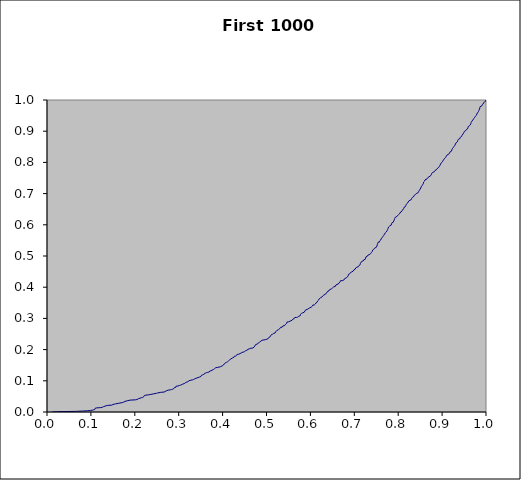
| Category | Series 0 |
|---|---|
| 0.011249421808192899 | 0 |
| 0.011249421808192899 | 0.001 |
| 0.021897918081891826 | 0.001 |
| 0.021897918081891826 | 0.002 |
| 0.06523315118367282 | 0.002 |
| 0.06523315118367282 | 0.003 |
| 0.0807544607324291 | 0.003 |
| 0.0807544607324291 | 0.004 |
| 0.09263250961139953 | 0.004 |
| 0.09263250961139953 | 0.005 |
| 0.09911125920864808 | 0.005 |
| 0.09911125920864808 | 0.006 |
| 0.10405232745592542 | 0.006 |
| 0.10405232745592542 | 0.007 |
| 0.10646404156951107 | 0.007 |
| 0.10646404156951107 | 0.008 |
| 0.10877796803790227 | 0.008 |
| 0.10877796803790227 | 0.009 |
| 0.1092573643612986 | 0.009 |
| 0.1092573643612986 | 0.01 |
| 0.10928343912602351 | 0.01 |
| 0.10928343912602351 | 0.011 |
| 0.1096808189038792 | 0.011 |
| 0.1096808189038792 | 0.012 |
| 0.11061091958944612 | 0.012 |
| 0.11061091958944612 | 0.013 |
| 0.11210296974543989 | 0.013 |
| 0.11210296974543989 | 0.014 |
| 0.12171973786751943 | 0.014 |
| 0.12171973786751943 | 0.015 |
| 0.12582377929541136 | 0.015 |
| 0.12582377929541136 | 0.016 |
| 0.12750954244039198 | 0.016 |
| 0.12750954244039198 | 0.017 |
| 0.1285424942450191 | 0.017 |
| 0.1285424942450191 | 0.018 |
| 0.1304585118417624 | 0.018 |
| 0.1304585118417624 | 0.019 |
| 0.13259435266144284 | 0.019 |
| 0.13259435266144284 | 0.02 |
| 0.13455305386940608 | 0.02 |
| 0.13455305386940608 | 0.021 |
| 0.13728534370316464 | 0.021 |
| 0.13728534370316464 | 0.022 |
| 0.14752125398919447 | 0.022 |
| 0.14752125398919447 | 0.023 |
| 0.14861249581178348 | 0.023 |
| 0.14861249581178348 | 0.024 |
| 0.15020557822087643 | 0.024 |
| 0.15020557822087643 | 0.025 |
| 0.15296926538120717 | 0.025 |
| 0.15296926538120717 | 0.026 |
| 0.15590705263605067 | 0.026 |
| 0.15590705263605067 | 0.027 |
| 0.1581368723343945 | 0.027 |
| 0.1581368723343945 | 0.028 |
| 0.16342433042483748 | 0.028 |
| 0.16342433042483748 | 0.029 |
| 0.1655110424803354 | 0.029 |
| 0.1655110424803354 | 0.03 |
| 0.1713311051522884 | 0.03 |
| 0.1713311051522884 | 0.031 |
| 0.17248337471203395 | 0.031 |
| 0.17248337471203395 | 0.032 |
| 0.1750887045038983 | 0.032 |
| 0.1750887045038983 | 0.033 |
| 0.17592749082593775 | 0.033 |
| 0.17592749082593775 | 0.034 |
| 0.17764236055978683 | 0.034 |
| 0.17764236055978683 | 0.035 |
| 0.17927532334015206 | 0.035 |
| 0.17927532334015206 | 0.036 |
| 0.18276183317802958 | 0.036 |
| 0.18276183317802958 | 0.037 |
| 0.18423369609616894 | 0.037 |
| 0.18423369609616894 | 0.038 |
| 0.18887326001306126 | 0.038 |
| 0.18887326001306126 | 0.039 |
| 0.20105487485812018 | 0.039 |
| 0.20105487485812018 | 0.04 |
| 0.20483416538454313 | 0.04 |
| 0.20483416538454313 | 0.041 |
| 0.20536459177715305 | 0.041 |
| 0.20536459177715305 | 0.042 |
| 0.20568834324547217 | 0.042 |
| 0.20568834324547217 | 0.043 |
| 0.20897664814304123 | 0.043 |
| 0.20897664814304123 | 0.044 |
| 0.21082633518358534 | 0.044 |
| 0.21082633518358534 | 0.045 |
| 0.21104864177050434 | 0.045 |
| 0.21104864177050434 | 0.046 |
| 0.21564698234092236 | 0.046 |
| 0.21564698234092236 | 0.047 |
| 0.21815375393502112 | 0.047 |
| 0.21815375393502112 | 0.048 |
| 0.21995019777628144 | 0.048 |
| 0.21995019777628144 | 0.049 |
| 0.2204865942727415 | 0.049 |
| 0.2204865942727415 | 0.05 |
| 0.22053192893236662 | 0.05 |
| 0.22053192893236662 | 0.051 |
| 0.22124137839260483 | 0.051 |
| 0.22124137839260483 | 0.052 |
| 0.22189559907805162 | 0.052 |
| 0.22189559907805162 | 0.053 |
| 0.22332866249805328 | 0.053 |
| 0.22332866249805328 | 0.054 |
| 0.225313524360659 | 0.054 |
| 0.225313524360659 | 0.055 |
| 0.23088702599780933 | 0.055 |
| 0.23088702599780933 | 0.056 |
| 0.2350986549685867 | 0.056 |
| 0.2350986549685867 | 0.057 |
| 0.23540107716843792 | 0.057 |
| 0.23540107716843792 | 0.058 |
| 0.24229875351471067 | 0.058 |
| 0.24229875351471067 | 0.059 |
| 0.24387414313903658 | 0.059 |
| 0.24387414313903658 | 0.06 |
| 0.2494074127996318 | 0.06 |
| 0.2494074127996318 | 0.061 |
| 0.25186187573036956 | 0.061 |
| 0.25186187573036956 | 0.062 |
| 0.2531476491343894 | 0.062 |
| 0.2531476491343894 | 0.063 |
| 0.2590508489690144 | 0.063 |
| 0.2590508489690144 | 0.064 |
| 0.2664827592374227 | 0.064 |
| 0.2664827592374227 | 0.065 |
| 0.2688020099562397 | 0.065 |
| 0.2688020099562397 | 0.066 |
| 0.26918575447161736 | 0.066 |
| 0.26918575447161736 | 0.067 |
| 0.27068364639911896 | 0.067 |
| 0.27068364639911896 | 0.068 |
| 0.27160345400900543 | 0.068 |
| 0.27160345400900543 | 0.069 |
| 0.2722355204352449 | 0.069 |
| 0.2722355204352449 | 0.07 |
| 0.2761165909060285 | 0.07 |
| 0.2761165909060285 | 0.071 |
| 0.28067163154526037 | 0.071 |
| 0.28067163154526037 | 0.072 |
| 0.2835442600330927 | 0.072 |
| 0.2835442600330927 | 0.073 |
| 0.2862815536726706 | 0.073 |
| 0.2862815536726706 | 0.074 |
| 0.2874402215660074 | 0.074 |
| 0.2874402215660074 | 0.075 |
| 0.2889093945239742 | 0.075 |
| 0.2889093945239742 | 0.076 |
| 0.2893299529715815 | 0.076 |
| 0.2893299529715815 | 0.077 |
| 0.29059601815584263 | 0.077 |
| 0.29059601815584263 | 0.078 |
| 0.29066765360203234 | 0.078 |
| 0.29066765360203234 | 0.079 |
| 0.293387623630287 | 0.079 |
| 0.293387623630287 | 0.08 |
| 0.293471716909933 | 0.08 |
| 0.293471716909933 | 0.081 |
| 0.2936748131528409 | 0.081 |
| 0.2936748131528409 | 0.082 |
| 0.29422580143166954 | 0.082 |
| 0.29422580143166954 | 0.083 |
| 0.2977863811714314 | 0.083 |
| 0.2977863811714314 | 0.084 |
| 0.30002222580208876 | 0.084 |
| 0.30002222580208876 | 0.085 |
| 0.3015306371026716 | 0.085 |
| 0.3015306371026716 | 0.086 |
| 0.3040463176200329 | 0.086 |
| 0.3040463176200329 | 0.087 |
| 0.30449822905675206 | 0.087 |
| 0.30449822905675206 | 0.088 |
| 0.3049871862406665 | 0.088 |
| 0.3049871862406665 | 0.089 |
| 0.3087590019793998 | 0.089 |
| 0.3087590019793998 | 0.09 |
| 0.30966212356720474 | 0.09 |
| 0.30966212356720474 | 0.091 |
| 0.3109875620651161 | 0.091 |
| 0.3109875620651161 | 0.092 |
| 0.3139640283720488 | 0.092 |
| 0.3139640283720488 | 0.093 |
| 0.3145524105345959 | 0.093 |
| 0.3145524105345959 | 0.094 |
| 0.3158534689207089 | 0.094 |
| 0.3158534689207089 | 0.095 |
| 0.3163986057475938 | 0.095 |
| 0.3163986057475938 | 0.096 |
| 0.31682415556491134 | 0.096 |
| 0.31682415556491134 | 0.097 |
| 0.32080660699942676 | 0.097 |
| 0.32080660699942676 | 0.098 |
| 0.3212219577814596 | 0.098 |
| 0.3212219577814596 | 0.099 |
| 0.3218245111582825 | 0.099 |
| 0.3218245111582825 | 0.1 |
| 0.32325844579217367 | 0.1 |
| 0.32325844579217367 | 0.101 |
| 0.3233912679575954 | 0.101 |
| 0.3233912679575954 | 0.102 |
| 0.3278516912646725 | 0.102 |
| 0.3278516912646725 | 0.103 |
| 0.3311631151056512 | 0.103 |
| 0.3311631151056512 | 0.104 |
| 0.3337775687308842 | 0.104 |
| 0.3337775687308842 | 0.105 |
| 0.33536681212985264 | 0.105 |
| 0.33536681212985264 | 0.106 |
| 0.3360530583206744 | 0.106 |
| 0.3360530583206744 | 0.107 |
| 0.33727365891195454 | 0.107 |
| 0.33727365891195454 | 0.108 |
| 0.33761581012432174 | 0.108 |
| 0.33761581012432174 | 0.109 |
| 0.3413597107412938 | 0.109 |
| 0.3413597107412938 | 0.11 |
| 0.3417449524486291 | 0.11 |
| 0.3417449524486291 | 0.111 |
| 0.34282517261200224 | 0.111 |
| 0.34282517261200224 | 0.112 |
| 0.3473685717020326 | 0.112 |
| 0.3473685717020326 | 0.113 |
| 0.3490914555433698 | 0.113 |
| 0.3490914555433698 | 0.114 |
| 0.35070825327676586 | 0.114 |
| 0.35070825327676586 | 0.115 |
| 0.3517873820542869 | 0.115 |
| 0.3517873820542869 | 0.116 |
| 0.35201455587927766 | 0.116 |
| 0.35201455587927766 | 0.117 |
| 0.3521976517083399 | 0.117 |
| 0.3521976517083399 | 0.118 |
| 0.3522035509403344 | 0.118 |
| 0.3522035509403344 | 0.119 |
| 0.3545239128471343 | 0.119 |
| 0.3545239128471343 | 0.12 |
| 0.35574020971307757 | 0.12 |
| 0.35574020971307757 | 0.121 |
| 0.3572883423053956 | 0.121 |
| 0.3572883423053956 | 0.122 |
| 0.35760124884739386 | 0.122 |
| 0.35760124884739386 | 0.123 |
| 0.35921498873511853 | 0.123 |
| 0.35921498873511853 | 0.124 |
| 0.3601877921714243 | 0.124 |
| 0.3601877921714243 | 0.125 |
| 0.3618108695276604 | 0.125 |
| 0.3618108695276604 | 0.126 |
| 0.3629439658469081 | 0.126 |
| 0.3629439658469081 | 0.127 |
| 0.36608536857781754 | 0.127 |
| 0.36608536857781754 | 0.128 |
| 0.3689463281720448 | 0.128 |
| 0.3689463281720448 | 0.129 |
| 0.3692220418669596 | 0.129 |
| 0.3692220418669596 | 0.13 |
| 0.370487820085008 | 0.13 |
| 0.370487820085008 | 0.131 |
| 0.3714015859730607 | 0.131 |
| 0.3714015859730607 | 0.132 |
| 0.3714711372366517 | 0.132 |
| 0.3714711372366517 | 0.133 |
| 0.37344216016006876 | 0.133 |
| 0.37344216016006876 | 0.134 |
| 0.3758157736674235 | 0.134 |
| 0.3758157736674235 | 0.135 |
| 0.3768092378812035 | 0.135 |
| 0.3768092378812035 | 0.136 |
| 0.3790477668345028 | 0.136 |
| 0.3790477668345028 | 0.137 |
| 0.3796178426483507 | 0.137 |
| 0.3796178426483507 | 0.138 |
| 0.3807772708818114 | 0.138 |
| 0.3807772708818114 | 0.139 |
| 0.38159103867862193 | 0.139 |
| 0.38159103867862193 | 0.14 |
| 0.3824347860305835 | 0.14 |
| 0.3824347860305835 | 0.141 |
| 0.3827413827421483 | 0.141 |
| 0.3827413827421483 | 0.142 |
| 0.3845599507331962 | 0.142 |
| 0.3845599507331962 | 0.143 |
| 0.38891042722963515 | 0.143 |
| 0.38891042722963515 | 0.144 |
| 0.39072047784214664 | 0.144 |
| 0.39072047784214664 | 0.145 |
| 0.3949585825001312 | 0.145 |
| 0.3949585825001312 | 0.146 |
| 0.39610399991559364 | 0.146 |
| 0.39610399991559364 | 0.147 |
| 0.39628005008507333 | 0.147 |
| 0.39628005008507333 | 0.148 |
| 0.3992876751969484 | 0.148 |
| 0.3992876751969484 | 0.149 |
| 0.40116779438668815 | 0.149 |
| 0.40116779438668815 | 0.15 |
| 0.4016791358136964 | 0.15 |
| 0.4016791358136964 | 0.151 |
| 0.40185636481461123 | 0.151 |
| 0.40185636481461123 | 0.152 |
| 0.4020348076575973 | 0.152 |
| 0.4020348076575973 | 0.153 |
| 0.40360673092895993 | 0.153 |
| 0.40360673092895993 | 0.154 |
| 0.40480905703892095 | 0.154 |
| 0.40480905703892095 | 0.155 |
| 0.4050719875682554 | 0.155 |
| 0.4050719875682554 | 0.156 |
| 0.40547329463613474 | 0.156 |
| 0.40547329463613474 | 0.157 |
| 0.4058862553466577 | 0.157 |
| 0.4058862553466577 | 0.158 |
| 0.4062285581140393 | 0.158 |
| 0.4062285581140393 | 0.159 |
| 0.4087463465819142 | 0.159 |
| 0.4087463465819142 | 0.16 |
| 0.4109655259528265 | 0.16 |
| 0.4109655259528265 | 0.161 |
| 0.41125949607083 | 0.161 |
| 0.41125949607083 | 0.162 |
| 0.4117396129395464 | 0.162 |
| 0.4117396129395464 | 0.163 |
| 0.4131650342620507 | 0.163 |
| 0.4131650342620507 | 0.164 |
| 0.41357675492989415 | 0.164 |
| 0.41357675492989415 | 0.165 |
| 0.4136700594340004 | 0.165 |
| 0.4136700594340004 | 0.166 |
| 0.4156614445506895 | 0.166 |
| 0.4156614445506895 | 0.167 |
| 0.41601854964437796 | 0.167 |
| 0.41601854964437796 | 0.168 |
| 0.41611290765455033 | 0.168 |
| 0.41611290765455033 | 0.169 |
| 0.417493631801864 | 0.169 |
| 0.417493631801864 | 0.17 |
| 0.4188916983045917 | 0.17 |
| 0.4188916983045917 | 0.171 |
| 0.4208379821221654 | 0.171 |
| 0.4208379821221654 | 0.172 |
| 0.42115373891967334 | 0.172 |
| 0.42115373891967334 | 0.173 |
| 0.42205031541449756 | 0.173 |
| 0.42205031541449756 | 0.174 |
| 0.42302253945022683 | 0.174 |
| 0.42302253945022683 | 0.175 |
| 0.4255545243436441 | 0.175 |
| 0.4255545243436441 | 0.176 |
| 0.4258677932433817 | 0.176 |
| 0.4258677932433817 | 0.177 |
| 0.42681194384335275 | 0.177 |
| 0.42681194384335275 | 0.178 |
| 0.4269480113402916 | 0.178 |
| 0.4269480113402916 | 0.179 |
| 0.42935621089261156 | 0.179 |
| 0.42935621089261156 | 0.18 |
| 0.4294714508657256 | 0.18 |
| 0.4294714508657256 | 0.181 |
| 0.43187029074810984 | 0.181 |
| 0.43187029074810984 | 0.182 |
| 0.43261605053863406 | 0.182 |
| 0.43261605053863406 | 0.183 |
| 0.43275833479768117 | 0.183 |
| 0.43275833479768117 | 0.184 |
| 0.43317002222324286 | 0.184 |
| 0.43317002222324286 | 0.185 |
| 0.43664353031998987 | 0.185 |
| 0.43664353031998987 | 0.186 |
| 0.4372563670955029 | 0.186 |
| 0.4372563670955029 | 0.187 |
| 0.4396434383547464 | 0.187 |
| 0.4396434383547464 | 0.188 |
| 0.4397017219194328 | 0.188 |
| 0.4397017219194328 | 0.189 |
| 0.44053109392780376 | 0.189 |
| 0.44053109392780376 | 0.19 |
| 0.4429448446810618 | 0.19 |
| 0.4429448446810618 | 0.191 |
| 0.4445297881575609 | 0.191 |
| 0.4445297881575609 | 0.192 |
| 0.4466935050245848 | 0.192 |
| 0.4466935050245848 | 0.193 |
| 0.44939216450777775 | 0.193 |
| 0.44939216450777775 | 0.194 |
| 0.450599185572192 | 0.194 |
| 0.450599185572192 | 0.195 |
| 0.4508285949500728 | 0.195 |
| 0.4508285949500728 | 0.196 |
| 0.45194962642018577 | 0.196 |
| 0.45194962642018577 | 0.197 |
| 0.4522911760754822 | 0.197 |
| 0.4522911760754822 | 0.198 |
| 0.4555851932242986 | 0.198 |
| 0.4555851932242986 | 0.199 |
| 0.4565087693150965 | 0.199 |
| 0.4565087693150965 | 0.2 |
| 0.457504789345731 | 0.2 |
| 0.457504789345731 | 0.201 |
| 0.45787742815257404 | 0.201 |
| 0.45787742815257404 | 0.202 |
| 0.46041356228416236 | 0.202 |
| 0.46041356228416236 | 0.203 |
| 0.4611192561323176 | 0.203 |
| 0.4611192561323176 | 0.204 |
| 0.46294729006585267 | 0.204 |
| 0.46294729006585267 | 0.205 |
| 0.4690134858084484 | 0.205 |
| 0.4690134858084484 | 0.206 |
| 0.4694699654079382 | 0.206 |
| 0.4694699654079382 | 0.207 |
| 0.4696967387535855 | 0.207 |
| 0.4696967387535855 | 0.208 |
| 0.4715600149139883 | 0.208 |
| 0.4715600149139883 | 0.209 |
| 0.4723377382072869 | 0.209 |
| 0.4723377382072869 | 0.21 |
| 0.47308162484055793 | 0.21 |
| 0.47308162484055793 | 0.211 |
| 0.4736276827972035 | 0.211 |
| 0.4736276827972035 | 0.212 |
| 0.47379882273148494 | 0.212 |
| 0.47379882273148494 | 0.213 |
| 0.4747578372860722 | 0.213 |
| 0.4747578372860722 | 0.214 |
| 0.4749102946972708 | 0.214 |
| 0.4749102946972708 | 0.215 |
| 0.4750225363021873 | 0.215 |
| 0.4750225363021873 | 0.216 |
| 0.4765904708324238 | 0.216 |
| 0.4765904708324238 | 0.217 |
| 0.4767378248125126 | 0.217 |
| 0.4767378248125126 | 0.218 |
| 0.47959608060456876 | 0.218 |
| 0.47959608060456876 | 0.219 |
| 0.47993215693303515 | 0.219 |
| 0.47993215693303515 | 0.22 |
| 0.480868711158164 | 0.22 |
| 0.480868711158164 | 0.221 |
| 0.4815846149410033 | 0.221 |
| 0.4815846149410033 | 0.222 |
| 0.4817563442199761 | 0.222 |
| 0.4817563442199761 | 0.223 |
| 0.4827006339544077 | 0.223 |
| 0.4827006339544077 | 0.224 |
| 0.4845554604608543 | 0.224 |
| 0.4845554604608543 | 0.225 |
| 0.48529274301962777 | 0.225 |
| 0.48529274301962777 | 0.226 |
| 0.4855100597031753 | 0.226 |
| 0.4855100597031753 | 0.227 |
| 0.4870680216350006 | 0.227 |
| 0.4870680216350006 | 0.228 |
| 0.48736225417345536 | 0.228 |
| 0.48736225417345536 | 0.229 |
| 0.48881520709044585 | 0.229 |
| 0.48881520709044585 | 0.23 |
| 0.48996516723415806 | 0.23 |
| 0.48996516723415806 | 0.231 |
| 0.49044035579272555 | 0.231 |
| 0.49044035579272555 | 0.232 |
| 0.4978272222617181 | 0.232 |
| 0.4978272222617181 | 0.233 |
| 0.4979410893410263 | 0.233 |
| 0.4979410893410263 | 0.234 |
| 0.5026501339941281 | 0.234 |
| 0.5026501339941281 | 0.235 |
| 0.5042813666066718 | 0.235 |
| 0.5042813666066718 | 0.236 |
| 0.5044220796463749 | 0.236 |
| 0.5044220796463749 | 0.237 |
| 0.5045342969493823 | 0.237 |
| 0.5045342969493823 | 0.238 |
| 0.505987843320744 | 0.238 |
| 0.505987843320744 | 0.239 |
| 0.5060850047002666 | 0.239 |
| 0.5060850047002666 | 0.24 |
| 0.507328387043216 | 0.24 |
| 0.507328387043216 | 0.241 |
| 0.5079773136335938 | 0.241 |
| 0.5079773136335938 | 0.242 |
| 0.5089497839653756 | 0.242 |
| 0.5089497839653756 | 0.243 |
| 0.5093478847308652 | 0.243 |
| 0.5093478847308652 | 0.244 |
| 0.5105190893524388 | 0.244 |
| 0.5105190893524388 | 0.245 |
| 0.5106794876541352 | 0.245 |
| 0.5106794876541352 | 0.246 |
| 0.5111668536550172 | 0.246 |
| 0.5111668536550172 | 0.247 |
| 0.5112188816457179 | 0.247 |
| 0.5112188816457179 | 0.248 |
| 0.5126215997905283 | 0.248 |
| 0.5126215997905283 | 0.249 |
| 0.5137686408569023 | 0.249 |
| 0.5137686408569023 | 0.25 |
| 0.5141487028402247 | 0.25 |
| 0.5141487028402247 | 0.251 |
| 0.514722558956099 | 0.251 |
| 0.514722558956099 | 0.252 |
| 0.5164883680601163 | 0.252 |
| 0.5164883680601163 | 0.253 |
| 0.5193759139264669 | 0.253 |
| 0.5193759139264669 | 0.254 |
| 0.5197598293443793 | 0.254 |
| 0.5197598293443793 | 0.255 |
| 0.5203232977164203 | 0.255 |
| 0.5203232977164203 | 0.256 |
| 0.5209627517010066 | 0.256 |
| 0.5209627517010066 | 0.257 |
| 0.5222140856684551 | 0.257 |
| 0.5222140856684551 | 0.258 |
| 0.5224796490614518 | 0.258 |
| 0.5224796490614518 | 0.259 |
| 0.5226923157140931 | 0.259 |
| 0.5226923157140931 | 0.26 |
| 0.5232346469884467 | 0.26 |
| 0.5232346469884467 | 0.261 |
| 0.524535123631277 | 0.261 |
| 0.524535123631277 | 0.262 |
| 0.5251040575780742 | 0.262 |
| 0.5251040575780742 | 0.263 |
| 0.5252651934115584 | 0.263 |
| 0.5252651934115584 | 0.264 |
| 0.5272489011610515 | 0.264 |
| 0.5272489011610515 | 0.265 |
| 0.5275197052584345 | 0.265 |
| 0.5275197052584345 | 0.266 |
| 0.5282280736531123 | 0.266 |
| 0.5282280736531123 | 0.267 |
| 0.5301658856525227 | 0.267 |
| 0.5301658856525227 | 0.268 |
| 0.5302459693545999 | 0.268 |
| 0.5302459693545999 | 0.269 |
| 0.5315755258477963 | 0.269 |
| 0.5315755258477963 | 0.27 |
| 0.5317405542700235 | 0.27 |
| 0.5317405542700235 | 0.271 |
| 0.5319055391571146 | 0.271 |
| 0.5319055391571146 | 0.272 |
| 0.5358197725093767 | 0.272 |
| 0.5358197725093767 | 0.273 |
| 0.5362136401298212 | 0.273 |
| 0.5362136401298212 | 0.274 |
| 0.5370611730514834 | 0.274 |
| 0.5370611730514834 | 0.275 |
| 0.5375823166879748 | 0.275 |
| 0.5375823166879748 | 0.276 |
| 0.5395910689444929 | 0.276 |
| 0.5395910689444929 | 0.277 |
| 0.541476323440487 | 0.277 |
| 0.541476323440487 | 0.278 |
| 0.5427317754742556 | 0.278 |
| 0.5427317754742556 | 0.279 |
| 0.5429355325817526 | 0.279 |
| 0.5429355325817526 | 0.28 |
| 0.5433550089578614 | 0.28 |
| 0.5433550089578614 | 0.281 |
| 0.5438411885343831 | 0.281 |
| 0.5438411885343831 | 0.282 |
| 0.5440309159428603 | 0.282 |
| 0.5440309159428603 | 0.283 |
| 0.5450122353596646 | 0.283 |
| 0.5450122353596646 | 0.284 |
| 0.545947966389704 | 0.284 |
| 0.545947966389704 | 0.285 |
| 0.5463656162412323 | 0.285 |
| 0.5463656162412323 | 0.286 |
| 0.5464352212521673 | 0.286 |
| 0.5464352212521673 | 0.287 |
| 0.5464514037587934 | 0.287 |
| 0.5464514037587934 | 0.288 |
| 0.548305105457441 | 0.288 |
| 0.548305105457441 | 0.289 |
| 0.55001237851328 | 0.289 |
| 0.55001237851328 | 0.29 |
| 0.5516540407877566 | 0.29 |
| 0.5516540407877566 | 0.291 |
| 0.5521184966493393 | 0.291 |
| 0.5521184966493393 | 0.292 |
| 0.5551500112860211 | 0.292 |
| 0.5551500112860211 | 0.293 |
| 0.5558883896185011 | 0.293 |
| 0.5558883896185011 | 0.294 |
| 0.5583286015876231 | 0.294 |
| 0.5583286015876231 | 0.295 |
| 0.5587892659396099 | 0.295 |
| 0.5587892659396099 | 0.296 |
| 0.5593375574130077 | 0.296 |
| 0.5593375574130077 | 0.297 |
| 0.5604019296922261 | 0.297 |
| 0.5604019296922261 | 0.298 |
| 0.5626280067760266 | 0.298 |
| 0.5626280067760266 | 0.299 |
| 0.5627445769298121 | 0.299 |
| 0.5627445769298121 | 0.3 |
| 0.5638732604246404 | 0.3 |
| 0.5638732604246404 | 0.301 |
| 0.5639650438164676 | 0.301 |
| 0.5639650438164676 | 0.302 |
| 0.5643976594642972 | 0.302 |
| 0.5643976594642972 | 0.303 |
| 0.5680648654399378 | 0.303 |
| 0.5680648654399378 | 0.304 |
| 0.5710785995505661 | 0.304 |
| 0.5710785995505661 | 0.305 |
| 0.5718063373089591 | 0.305 |
| 0.5718063373089591 | 0.306 |
| 0.5720645291946762 | 0.306 |
| 0.5720645291946762 | 0.307 |
| 0.573709233438035 | 0.307 |
| 0.573709233438035 | 0.308 |
| 0.5748652888355352 | 0.308 |
| 0.5748652888355352 | 0.309 |
| 0.5770825256018898 | 0.309 |
| 0.5770825256018898 | 0.31 |
| 0.5771866483174436 | 0.31 |
| 0.5771866483174436 | 0.311 |
| 0.5772235433478209 | 0.311 |
| 0.5772235433478209 | 0.312 |
| 0.5773109266677225 | 0.312 |
| 0.5773109266677225 | 0.313 |
| 0.5786188973226809 | 0.313 |
| 0.5786188973226809 | 0.314 |
| 0.5786389403124875 | 0.314 |
| 0.5786389403124875 | 0.315 |
| 0.5787774493492687 | 0.315 |
| 0.5787774493492687 | 0.316 |
| 0.5796776962765396 | 0.316 |
| 0.5796776962765396 | 0.317 |
| 0.5818660285440289 | 0.317 |
| 0.5818660285440289 | 0.318 |
| 0.5826749042815463 | 0.318 |
| 0.5826749042815463 | 0.319 |
| 0.5833835432091734 | 0.319 |
| 0.5833835432091734 | 0.32 |
| 0.5860751653624666 | 0.32 |
| 0.5860751653624666 | 0.321 |
| 0.586673400013422 | 0.321 |
| 0.586673400013422 | 0.322 |
| 0.5869734183578232 | 0.322 |
| 0.5869734183578232 | 0.323 |
| 0.587597544816653 | 0.323 |
| 0.587597544816653 | 0.324 |
| 0.5881289013950803 | 0.324 |
| 0.5881289013950803 | 0.325 |
| 0.5891415100655889 | 0.325 |
| 0.5891415100655889 | 0.326 |
| 0.5893201097785676 | 0.326 |
| 0.5893201097785676 | 0.327 |
| 0.5896580512216921 | 0.327 |
| 0.5896580512216921 | 0.328 |
| 0.5924530931749203 | 0.328 |
| 0.5924530931749203 | 0.329 |
| 0.5931702757522926 | 0.329 |
| 0.5931702757522926 | 0.33 |
| 0.5937570572916097 | 0.33 |
| 0.5937570572916097 | 0.331 |
| 0.5948986407286679 | 0.331 |
| 0.5948986407286679 | 0.332 |
| 0.5968504239479828 | 0.332 |
| 0.5968504239479828 | 0.333 |
| 0.59746225229825 | 0.333 |
| 0.59746225229825 | 0.334 |
| 0.5975039492726097 | 0.334 |
| 0.5975039492726097 | 0.335 |
| 0.5986512667009289 | 0.335 |
| 0.5986512667009289 | 0.336 |
| 0.6017974682787703 | 0.336 |
| 0.6017974682787703 | 0.337 |
| 0.6020101268498207 | 0.337 |
| 0.6020101268498207 | 0.338 |
| 0.6031920830625958 | 0.338 |
| 0.6031920830625958 | 0.339 |
| 0.6043168455677775 | 0.339 |
| 0.6043168455677775 | 0.34 |
| 0.6043194599973373 | 0.34 |
| 0.6043194599973373 | 0.341 |
| 0.6051132932854387 | 0.341 |
| 0.6051132932854387 | 0.342 |
| 0.6057763103128806 | 0.342 |
| 0.6057763103128806 | 0.343 |
| 0.6088111327461219 | 0.343 |
| 0.6088111327461219 | 0.344 |
| 0.6094166354823576 | 0.344 |
| 0.6094166354823576 | 0.345 |
| 0.6106860507347589 | 0.345 |
| 0.6106860507347589 | 0.346 |
| 0.6111514266677441 | 0.346 |
| 0.6111514266677441 | 0.347 |
| 0.6119188503874389 | 0.347 |
| 0.6119188503874389 | 0.348 |
| 0.6121558833473152 | 0.348 |
| 0.6121558833473152 | 0.349 |
| 0.6129847978524068 | 0.349 |
| 0.6129847978524068 | 0.35 |
| 0.6131794083992589 | 0.35 |
| 0.6131794083992589 | 0.351 |
| 0.6145048868322224 | 0.351 |
| 0.6145048868322224 | 0.352 |
| 0.6152903382579977 | 0.352 |
| 0.6152903382579977 | 0.353 |
| 0.6154327094016 | 0.353 |
| 0.6154327094016 | 0.354 |
| 0.616355204360489 | 0.354 |
| 0.616355204360489 | 0.355 |
| 0.6164817933497344 | 0.355 |
| 0.6164817933497344 | 0.356 |
| 0.6180251090993006 | 0.356 |
| 0.6180251090993006 | 0.357 |
| 0.6182573211400452 | 0.357 |
| 0.6182573211400452 | 0.358 |
| 0.6187366238254061 | 0.358 |
| 0.6187366238254061 | 0.359 |
| 0.6188268152584875 | 0.359 |
| 0.6188268152584875 | 0.36 |
| 0.6192585962134232 | 0.36 |
| 0.6192585962134232 | 0.361 |
| 0.6196592609244207 | 0.361 |
| 0.6196592609244207 | 0.362 |
| 0.6202401608683943 | 0.362 |
| 0.6202401608683943 | 0.363 |
| 0.6212044414760152 | 0.363 |
| 0.6212044414760152 | 0.364 |
| 0.6214380213070004 | 0.364 |
| 0.6214380213070004 | 0.365 |
| 0.6219687799350214 | 0.365 |
| 0.6219687799350214 | 0.366 |
| 0.6229371842826005 | 0.366 |
| 0.6229371842826005 | 0.367 |
| 0.6236564252665228 | 0.367 |
| 0.6236564252665228 | 0.368 |
| 0.6259761423871857 | 0.368 |
| 0.6259761423871857 | 0.369 |
| 0.6264756570670645 | 0.369 |
| 0.6264756570670645 | 0.37 |
| 0.626537151355475 | 0.37 |
| 0.626537151355475 | 0.371 |
| 0.627905607655712 | 0.371 |
| 0.627905607655712 | 0.372 |
| 0.6287738836301561 | 0.372 |
| 0.6287738836301561 | 0.373 |
| 0.6294430686842593 | 0.373 |
| 0.6294430686842593 | 0.374 |
| 0.6296110434668066 | 0.374 |
| 0.6296110434668066 | 0.375 |
| 0.6305541138914029 | 0.375 |
| 0.6305541138914029 | 0.376 |
| 0.6325986662555002 | 0.376 |
| 0.6325986662555002 | 0.377 |
| 0.6339704736572748 | 0.377 |
| 0.6339704736572748 | 0.378 |
| 0.6351498407558812 | 0.378 |
| 0.6351498407558812 | 0.379 |
| 0.6353387721957354 | 0.379 |
| 0.6353387721957354 | 0.38 |
| 0.6357810547119966 | 0.38 |
| 0.6357810547119966 | 0.381 |
| 0.6369923003584173 | 0.381 |
| 0.6369923003584173 | 0.382 |
| 0.6379083372527639 | 0.382 |
| 0.6379083372527639 | 0.383 |
| 0.6381330027209235 | 0.383 |
| 0.6381330027209235 | 0.384 |
| 0.6387644151629712 | 0.384 |
| 0.6387644151629712 | 0.385 |
| 0.6389945888632037 | 0.385 |
| 0.6389945888632037 | 0.386 |
| 0.639362838360495 | 0.386 |
| 0.639362838360495 | 0.387 |
| 0.6406196227771356 | 0.387 |
| 0.6406196227771356 | 0.388 |
| 0.6422337999780982 | 0.388 |
| 0.6422337999780982 | 0.389 |
| 0.6427080383394862 | 0.389 |
| 0.6427080383394862 | 0.39 |
| 0.6428965883266488 | 0.39 |
| 0.6428965883266488 | 0.391 |
| 0.64350231229169 | 0.391 |
| 0.64350231229169 | 0.392 |
| 0.6436258939187907 | 0.392 |
| 0.6436258939187907 | 0.393 |
| 0.6448024426011549 | 0.393 |
| 0.6448024426011549 | 0.394 |
| 0.6448834496736491 | 0.394 |
| 0.6448834496736491 | 0.395 |
| 0.6483094953767626 | 0.395 |
| 0.6483094953767626 | 0.396 |
| 0.6486144570609997 | 0.396 |
| 0.6486144570609997 | 0.397 |
| 0.6498340048658052 | 0.397 |
| 0.6498340048658052 | 0.398 |
| 0.6507382011252372 | 0.398 |
| 0.6507382011252372 | 0.399 |
| 0.6517704356523994 | 0.399 |
| 0.6517704356523994 | 0.4 |
| 0.6524516724594362 | 0.4 |
| 0.6524516724594362 | 0.401 |
| 0.6530821035511961 | 0.401 |
| 0.6530821035511961 | 0.402 |
| 0.654077805916523 | 0.402 |
| 0.654077805916523 | 0.403 |
| 0.6572314267891367 | 0.403 |
| 0.6572314267891367 | 0.404 |
| 0.6576374780408114 | 0.404 |
| 0.6576374780408114 | 0.405 |
| 0.6579374729901266 | 0.405 |
| 0.6579374729901266 | 0.406 |
| 0.6579604586271598 | 0.406 |
| 0.6579604586271598 | 0.407 |
| 0.6585972963268428 | 0.407 |
| 0.6585972963268428 | 0.408 |
| 0.6600562271376746 | 0.408 |
| 0.6600562271376746 | 0.409 |
| 0.660586238051264 | 0.409 |
| 0.660586238051264 | 0.41 |
| 0.6633924613668194 | 0.41 |
| 0.6633924613668194 | 0.411 |
| 0.6642234446949064 | 0.411 |
| 0.6642234446949064 | 0.412 |
| 0.6645869579258277 | 0.412 |
| 0.6645869579258277 | 0.413 |
| 0.6652625014112356 | 0.413 |
| 0.6652625014112356 | 0.414 |
| 0.6666106008838641 | 0.414 |
| 0.6666106008838641 | 0.415 |
| 0.6667663082441025 | 0.415 |
| 0.6667663082441025 | 0.416 |
| 0.6670120312543087 | 0.416 |
| 0.6670120312543087 | 0.417 |
| 0.6676059935887697 | 0.417 |
| 0.6676059935887697 | 0.418 |
| 0.6680865847296211 | 0.418 |
| 0.6680865847296211 | 0.419 |
| 0.6685499303397504 | 0.419 |
| 0.6685499303397504 | 0.42 |
| 0.6686750506797231 | 0.42 |
| 0.6686750506797231 | 0.421 |
| 0.67283254265387 | 0.421 |
| 0.67283254265387 | 0.422 |
| 0.6733218516093241 | 0.422 |
| 0.6733218516093241 | 0.423 |
| 0.6762284886850896 | 0.423 |
| 0.6762284886850896 | 0.424 |
| 0.6763473046152666 | 0.424 |
| 0.6763473046152666 | 0.425 |
| 0.6767232202972496 | 0.425 |
| 0.6767232202972496 | 0.426 |
| 0.6776075672373701 | 0.426 |
| 0.6776075672373701 | 0.427 |
| 0.6778118258765987 | 0.427 |
| 0.6778118258765987 | 0.428 |
| 0.6778582361262263 | 0.428 |
| 0.6778582361262263 | 0.429 |
| 0.6789905823304688 | 0.429 |
| 0.6789905823304688 | 0.43 |
| 0.681645327506794 | 0.43 |
| 0.681645327506794 | 0.431 |
| 0.6822476428984726 | 0.431 |
| 0.6822476428984726 | 0.432 |
| 0.682624196593867 | 0.432 |
| 0.682624196593867 | 0.433 |
| 0.6846004599829131 | 0.433 |
| 0.6846004599829131 | 0.434 |
| 0.6846977220898196 | 0.434 |
| 0.6846977220898196 | 0.435 |
| 0.6855616080756904 | 0.435 |
| 0.6855616080756904 | 0.436 |
| 0.6860751023719516 | 0.436 |
| 0.6860751023719516 | 0.437 |
| 0.6861839954865749 | 0.437 |
| 0.6861839954865749 | 0.438 |
| 0.6861849000370659 | 0.438 |
| 0.6861849000370659 | 0.439 |
| 0.6863860104837008 | 0.439 |
| 0.6863860104837008 | 0.44 |
| 0.6865670267984291 | 0.44 |
| 0.6865670267984291 | 0.441 |
| 0.6874446985646274 | 0.441 |
| 0.6874446985646274 | 0.442 |
| 0.6882782710888955 | 0.442 |
| 0.6882782710888955 | 0.443 |
| 0.6896915569578116 | 0.443 |
| 0.6896915569578116 | 0.444 |
| 0.6898571975173683 | 0.444 |
| 0.6898571975173683 | 0.445 |
| 0.6903026574554162 | 0.445 |
| 0.6903026574554162 | 0.446 |
| 0.6913695420050707 | 0.446 |
| 0.6913695420050707 | 0.447 |
| 0.6915308408137609 | 0.447 |
| 0.6915308408137609 | 0.448 |
| 0.6923813339461344 | 0.448 |
| 0.6923813339461344 | 0.449 |
| 0.6941687461939142 | 0.449 |
| 0.6941687461939142 | 0.45 |
| 0.6958572557928987 | 0.45 |
| 0.6958572557928987 | 0.451 |
| 0.6960995520674406 | 0.451 |
| 0.6960995520674406 | 0.452 |
| 0.6978870138762474 | 0.452 |
| 0.6978870138762474 | 0.453 |
| 0.698717148913131 | 0.453 |
| 0.698717148913131 | 0.454 |
| 0.6992493291324154 | 0.454 |
| 0.6992493291324154 | 0.455 |
| 0.6992722281819722 | 0.455 |
| 0.6992722281819722 | 0.456 |
| 0.7006465266287069 | 0.456 |
| 0.7006465266287069 | 0.457 |
| 0.7011734080620532 | 0.457 |
| 0.7011734080620532 | 0.458 |
| 0.7022427228340677 | 0.458 |
| 0.7022427228340677 | 0.459 |
| 0.702259479973941 | 0.459 |
| 0.702259479973941 | 0.46 |
| 0.7025308553214654 | 0.46 |
| 0.7025308553214654 | 0.461 |
| 0.7033348493076537 | 0.461 |
| 0.7033348493076537 | 0.462 |
| 0.7053757134470637 | 0.462 |
| 0.7053757134470637 | 0.463 |
| 0.7055537547255659 | 0.463 |
| 0.7055537547255659 | 0.464 |
| 0.7057855669717615 | 0.464 |
| 0.7057855669717615 | 0.465 |
| 0.7068754775879608 | 0.465 |
| 0.7068754775879608 | 0.466 |
| 0.7094359861818292 | 0.466 |
| 0.7094359861818292 | 0.467 |
| 0.7098587908932787 | 0.467 |
| 0.7098587908932787 | 0.468 |
| 0.7109323913455288 | 0.468 |
| 0.7109323913455288 | 0.469 |
| 0.7110020552571784 | 0.469 |
| 0.7110020552571784 | 0.47 |
| 0.7115600840500821 | 0.47 |
| 0.7115600840500821 | 0.471 |
| 0.7123260721053666 | 0.471 |
| 0.7123260721053666 | 0.472 |
| 0.7133202232690652 | 0.472 |
| 0.7133202232690652 | 0.473 |
| 0.7133662142828301 | 0.473 |
| 0.7133662142828301 | 0.474 |
| 0.7136273637402631 | 0.474 |
| 0.7136273637402631 | 0.475 |
| 0.7138754298990462 | 0.475 |
| 0.7138754298990462 | 0.476 |
| 0.7140672549197272 | 0.476 |
| 0.7140672549197272 | 0.477 |
| 0.7141230464399799 | 0.477 |
| 0.7141230464399799 | 0.478 |
| 0.7141568127062209 | 0.478 |
| 0.7141568127062209 | 0.479 |
| 0.7150229321139121 | 0.479 |
| 0.7150229321139121 | 0.48 |
| 0.715992288373078 | 0.48 |
| 0.715992288373078 | 0.481 |
| 0.7165571234462058 | 0.481 |
| 0.7165571234462058 | 0.482 |
| 0.7166873041495803 | 0.482 |
| 0.7166873041495803 | 0.483 |
| 0.718014460256699 | 0.483 |
| 0.718014460256699 | 0.484 |
| 0.7203130081390077 | 0.484 |
| 0.7203130081390077 | 0.485 |
| 0.7203936252178358 | 0.485 |
| 0.7203936252178358 | 0.486 |
| 0.7213106732734584 | 0.486 |
| 0.7213106732734584 | 0.487 |
| 0.7216432709367213 | 0.487 |
| 0.7216432709367213 | 0.488 |
| 0.7237741407136123 | 0.488 |
| 0.7237741407136123 | 0.489 |
| 0.724675170846741 | 0.489 |
| 0.724675170846741 | 0.49 |
| 0.7256004104927262 | 0.49 |
| 0.7256004104927262 | 0.491 |
| 0.7256980529907919 | 0.491 |
| 0.7256980529907919 | 0.492 |
| 0.7257639014780729 | 0.492 |
| 0.7257639014780729 | 0.493 |
| 0.725906271104606 | 0.493 |
| 0.725906271104606 | 0.494 |
| 0.726176735775662 | 0.494 |
| 0.726176735775662 | 0.495 |
| 0.726229524773025 | 0.495 |
| 0.726229524773025 | 0.496 |
| 0.7264253804586218 | 0.496 |
| 0.7264253804586218 | 0.497 |
| 0.7273410493821855 | 0.497 |
| 0.7273410493821855 | 0.498 |
| 0.7279627282345337 | 0.498 |
| 0.7279627282345337 | 0.499 |
| 0.7296632391733259 | 0.499 |
| 0.7296632391733259 | 0.5 |
| 0.7301687676205353 | 0.5 |
| 0.7301687676205353 | 0.501 |
| 0.7306725357279564 | 0.501 |
| 0.7306725357279564 | 0.502 |
| 0.7309586610580624 | 0.502 |
| 0.7309586610580624 | 0.503 |
| 0.7323769524062279 | 0.503 |
| 0.7323769524062279 | 0.504 |
| 0.733744908399423 | 0.504 |
| 0.733744908399423 | 0.505 |
| 0.7350158527704594 | 0.505 |
| 0.7350158527704594 | 0.506 |
| 0.7359840833404877 | 0.506 |
| 0.7359840833404877 | 0.507 |
| 0.7367924222642332 | 0.507 |
| 0.7367924222642332 | 0.508 |
| 0.7374461408638304 | 0.508 |
| 0.7374461408638304 | 0.509 |
| 0.7379289512883268 | 0.509 |
| 0.7379289512883268 | 0.51 |
| 0.7388949778293331 | 0.51 |
| 0.7388949778293331 | 0.511 |
| 0.7401082279542218 | 0.511 |
| 0.7401082279542218 | 0.512 |
| 0.7406728593308244 | 0.512 |
| 0.7406728593308244 | 0.513 |
| 0.7408600242821723 | 0.513 |
| 0.7408600242821723 | 0.514 |
| 0.7410794001504826 | 0.514 |
| 0.7410794001504826 | 0.515 |
| 0.7410925603203764 | 0.515 |
| 0.7410925603203764 | 0.516 |
| 0.741719255484518 | 0.516 |
| 0.741719255484518 | 0.517 |
| 0.7417217741133836 | 0.517 |
| 0.7417217741133836 | 0.518 |
| 0.7417998374987692 | 0.518 |
| 0.7417998374987692 | 0.519 |
| 0.7429141899212883 | 0.519 |
| 0.7429141899212883 | 0.52 |
| 0.7436265022365517 | 0.52 |
| 0.7436265022365517 | 0.521 |
| 0.7441079543307987 | 0.521 |
| 0.7441079543307987 | 0.522 |
| 0.7441281625817132 | 0.522 |
| 0.7441281625817132 | 0.523 |
| 0.7450280409302239 | 0.523 |
| 0.7450280409302239 | 0.524 |
| 0.7460590623537675 | 0.524 |
| 0.7460590623537675 | 0.525 |
| 0.7467597482290592 | 0.525 |
| 0.7467597482290592 | 0.526 |
| 0.7471471238590994 | 0.526 |
| 0.7471471238590994 | 0.527 |
| 0.7480595669527663 | 0.527 |
| 0.7480595669527663 | 0.528 |
| 0.7502604141916246 | 0.528 |
| 0.7502604141916246 | 0.529 |
| 0.7510292667036068 | 0.529 |
| 0.7510292667036068 | 0.53 |
| 0.7515031009860861 | 0.53 |
| 0.7515031009860861 | 0.531 |
| 0.7515503769155605 | 0.531 |
| 0.7515503769155605 | 0.532 |
| 0.7518715577794326 | 0.532 |
| 0.7518715577794326 | 0.533 |
| 0.7518993707685852 | 0.533 |
| 0.7518993707685852 | 0.534 |
| 0.7519292473589698 | 0.534 |
| 0.7519292473589698 | 0.535 |
| 0.7522530038735372 | 0.535 |
| 0.7522530038735372 | 0.536 |
| 0.7522631467927716 | 0.536 |
| 0.7522631467927716 | 0.537 |
| 0.7522733484202527 | 0.537 |
| 0.7522733484202527 | 0.538 |
| 0.7523297901009789 | 0.538 |
| 0.7523297901009789 | 0.539 |
| 0.753149487942095 | 0.539 |
| 0.753149487942095 | 0.54 |
| 0.7538860990464556 | 0.54 |
| 0.7538860990464556 | 0.541 |
| 0.7539609728432564 | 0.541 |
| 0.7539609728432564 | 0.542 |
| 0.7541031524158311 | 0.542 |
| 0.7541031524158311 | 0.543 |
| 0.754221087299773 | 0.543 |
| 0.754221087299773 | 0.544 |
| 0.7567866479403487 | 0.544 |
| 0.7567866479403487 | 0.545 |
| 0.7569772168525184 | 0.545 |
| 0.7569772168525184 | 0.546 |
| 0.7572945411749765 | 0.546 |
| 0.7572945411749765 | 0.547 |
| 0.7574084775031177 | 0.547 |
| 0.7574084775031177 | 0.548 |
| 0.7577527549174666 | 0.548 |
| 0.7577527549174666 | 0.549 |
| 0.7595407718475183 | 0.549 |
| 0.7595407718475183 | 0.55 |
| 0.7595451452805143 | 0.55 |
| 0.7595451452805143 | 0.551 |
| 0.7601660612169587 | 0.551 |
| 0.7601660612169587 | 0.552 |
| 0.7608106611630955 | 0.552 |
| 0.7608106611630955 | 0.553 |
| 0.7611422608573828 | 0.553 |
| 0.7611422608573828 | 0.554 |
| 0.7612205935325752 | 0.554 |
| 0.7612205935325752 | 0.555 |
| 0.761608348386071 | 0.555 |
| 0.761608348386071 | 0.556 |
| 0.7618261464744778 | 0.556 |
| 0.7618261464744778 | 0.557 |
| 0.7629165066520502 | 0.557 |
| 0.7629165066520502 | 0.558 |
| 0.7629825317581834 | 0.558 |
| 0.7629825317581834 | 0.559 |
| 0.763151743735293 | 0.559 |
| 0.763151743735293 | 0.56 |
| 0.7634970549895383 | 0.56 |
| 0.7634970549895383 | 0.561 |
| 0.7648489281646802 | 0.561 |
| 0.7648489281646802 | 0.562 |
| 0.7652778181574478 | 0.562 |
| 0.7652778181574478 | 0.563 |
| 0.765329145705898 | 0.563 |
| 0.765329145705898 | 0.564 |
| 0.7667490758198615 | 0.564 |
| 0.7667490758198615 | 0.565 |
| 0.7671775008141282 | 0.565 |
| 0.7671775008141282 | 0.566 |
| 0.767223516484446 | 0.566 |
| 0.767223516484446 | 0.567 |
| 0.7672875409123019 | 0.567 |
| 0.7672875409123019 | 0.568 |
| 0.768291985361771 | 0.568 |
| 0.768291985361771 | 0.569 |
| 0.768592362393536 | 0.569 |
| 0.768592362393536 | 0.57 |
| 0.7694822541234644 | 0.57 |
| 0.7694822541234644 | 0.571 |
| 0.7700577779574538 | 0.571 |
| 0.7700577779574538 | 0.572 |
| 0.7704144123576396 | 0.572 |
| 0.7704144123576396 | 0.573 |
| 0.7705487870905148 | 0.573 |
| 0.7705487870905148 | 0.574 |
| 0.7712675238869453 | 0.574 |
| 0.7712675238869453 | 0.575 |
| 0.7713310721602561 | 0.575 |
| 0.7713310721602561 | 0.576 |
| 0.771520572440686 | 0.576 |
| 0.771520572440686 | 0.577 |
| 0.7728547895967823 | 0.577 |
| 0.7728547895967823 | 0.578 |
| 0.772962406558076 | 0.578 |
| 0.772962406558076 | 0.579 |
| 0.7736299643654316 | 0.579 |
| 0.7736299643654316 | 0.58 |
| 0.7746085913153336 | 0.58 |
| 0.7746085913153336 | 0.581 |
| 0.7751330488475033 | 0.581 |
| 0.7751330488475033 | 0.582 |
| 0.7751813029848936 | 0.582 |
| 0.7751813029848936 | 0.583 |
| 0.7758440312552851 | 0.583 |
| 0.7758440312552851 | 0.584 |
| 0.7759180205744041 | 0.584 |
| 0.7759180205744041 | 0.585 |
| 0.7759203822477813 | 0.585 |
| 0.7759203822477813 | 0.586 |
| 0.7765300462755913 | 0.586 |
| 0.7765300462755913 | 0.587 |
| 0.7766462401101253 | 0.587 |
| 0.7766462401101253 | 0.588 |
| 0.7770151686318534 | 0.588 |
| 0.7770151686318534 | 0.589 |
| 0.7771930051347766 | 0.589 |
| 0.7771930051347766 | 0.59 |
| 0.7775743300208889 | 0.59 |
| 0.7775743300208889 | 0.591 |
| 0.7779993059865319 | 0.591 |
| 0.7779993059865319 | 0.592 |
| 0.7780740872214872 | 0.592 |
| 0.7780740872214872 | 0.593 |
| 0.7785057478894849 | 0.593 |
| 0.7785057478894849 | 0.594 |
| 0.7792478378146662 | 0.594 |
| 0.7792478378146662 | 0.595 |
| 0.7793812749402714 | 0.595 |
| 0.7793812749402714 | 0.596 |
| 0.7804435078850375 | 0.596 |
| 0.7804435078850375 | 0.597 |
| 0.7814512723216621 | 0.597 |
| 0.7814512723216621 | 0.598 |
| 0.7825627045731666 | 0.598 |
| 0.7825627045731666 | 0.599 |
| 0.7841050655654225 | 0.599 |
| 0.7841050655654225 | 0.6 |
| 0.7844797456338307 | 0.6 |
| 0.7844797456338307 | 0.601 |
| 0.7844876772279082 | 0.601 |
| 0.7844876772279082 | 0.602 |
| 0.7848160062635476 | 0.602 |
| 0.7848160062635476 | 0.603 |
| 0.784816215249799 | 0.603 |
| 0.784816215249799 | 0.604 |
| 0.7848323721034591 | 0.604 |
| 0.7848323721034591 | 0.605 |
| 0.7850951421824672 | 0.605 |
| 0.7850951421824672 | 0.606 |
| 0.7861015439108886 | 0.606 |
| 0.7861015439108886 | 0.607 |
| 0.788217952268257 | 0.607 |
| 0.788217952268257 | 0.608 |
| 0.7885959208403118 | 0.608 |
| 0.7885959208403118 | 0.609 |
| 0.7888425791183485 | 0.609 |
| 0.7888425791183485 | 0.61 |
| 0.7897232454222108 | 0.61 |
| 0.7897232454222108 | 0.611 |
| 0.7897524896495354 | 0.611 |
| 0.7897524896495354 | 0.612 |
| 0.7901772275603912 | 0.612 |
| 0.7901772275603912 | 0.613 |
| 0.790353047532036 | 0.613 |
| 0.790353047532036 | 0.614 |
| 0.7909670192152767 | 0.614 |
| 0.7909670192152767 | 0.615 |
| 0.7912846154829163 | 0.615 |
| 0.7912846154829163 | 0.616 |
| 0.7914185360684779 | 0.616 |
| 0.7914185360684779 | 0.617 |
| 0.7916270258998034 | 0.617 |
| 0.7916270258998034 | 0.618 |
| 0.7917059927449835 | 0.618 |
| 0.7917059927449835 | 0.619 |
| 0.7918641404203914 | 0.619 |
| 0.7918641404203914 | 0.62 |
| 0.7920255003484298 | 0.62 |
| 0.7920255003484298 | 0.621 |
| 0.7920487914337029 | 0.621 |
| 0.7920487914337029 | 0.622 |
| 0.7925759958059462 | 0.622 |
| 0.7925759958059462 | 0.623 |
| 0.7933718080685872 | 0.623 |
| 0.7933718080685872 | 0.624 |
| 0.7936341382131215 | 0.624 |
| 0.7936341382131215 | 0.625 |
| 0.795754297881831 | 0.625 |
| 0.795754297881831 | 0.626 |
| 0.7959860246398435 | 0.626 |
| 0.7959860246398435 | 0.627 |
| 0.7968809258905742 | 0.627 |
| 0.7968809258905742 | 0.628 |
| 0.7979499717454889 | 0.628 |
| 0.7979499717454889 | 0.629 |
| 0.7985637636001626 | 0.629 |
| 0.7985637636001626 | 0.63 |
| 0.7990370807763438 | 0.63 |
| 0.7990370807763438 | 0.631 |
| 0.8000113413325388 | 0.631 |
| 0.8000113413325388 | 0.632 |
| 0.8006703315547062 | 0.632 |
| 0.8006703315547062 | 0.633 |
| 0.8017252231461645 | 0.633 |
| 0.8017252231461645 | 0.634 |
| 0.802797097862073 | 0.634 |
| 0.802797097862073 | 0.635 |
| 0.8030456130280383 | 0.635 |
| 0.8030456130280383 | 0.636 |
| 0.8031644799623574 | 0.636 |
| 0.8031644799623574 | 0.637 |
| 0.8040040782992138 | 0.637 |
| 0.8040040782992138 | 0.638 |
| 0.804046704342638 | 0.638 |
| 0.804046704342638 | 0.639 |
| 0.8042519221969704 | 0.639 |
| 0.8042519221969704 | 0.64 |
| 0.8056901569049223 | 0.64 |
| 0.8056901569049223 | 0.641 |
| 0.8068058462702486 | 0.641 |
| 0.8068058462702486 | 0.642 |
| 0.8073924299953739 | 0.642 |
| 0.8073924299953739 | 0.643 |
| 0.8076009838109595 | 0.643 |
| 0.8076009838109595 | 0.644 |
| 0.8081805090176848 | 0.644 |
| 0.8081805090176848 | 0.645 |
| 0.8083528484278573 | 0.645 |
| 0.8083528484278573 | 0.646 |
| 0.8089724086497303 | 0.646 |
| 0.8089724086497303 | 0.647 |
| 0.8100834540194971 | 0.647 |
| 0.8100834540194971 | 0.648 |
| 0.8108891413416919 | 0.648 |
| 0.8108891413416919 | 0.649 |
| 0.8112496630574458 | 0.649 |
| 0.8112496630574458 | 0.65 |
| 0.8116645653395168 | 0.65 |
| 0.8116645653395168 | 0.651 |
| 0.8123750366712341 | 0.651 |
| 0.8123750366712341 | 0.652 |
| 0.8124116560530997 | 0.652 |
| 0.8124116560530997 | 0.653 |
| 0.8124332449936501 | 0.653 |
| 0.8124332449936501 | 0.654 |
| 0.8130650416595592 | 0.654 |
| 0.8130650416595592 | 0.655 |
| 0.8132584348082478 | 0.655 |
| 0.8132584348082478 | 0.656 |
| 0.813832323313276 | 0.656 |
| 0.813832323313276 | 0.657 |
| 0.8141989713501431 | 0.657 |
| 0.8141989713501431 | 0.658 |
| 0.8161542838094225 | 0.658 |
| 0.8161542838094225 | 0.659 |
| 0.8163198541517265 | 0.659 |
| 0.8163198541517265 | 0.66 |
| 0.8172273052013828 | 0.66 |
| 0.8172273052013828 | 0.661 |
| 0.8173800327933877 | 0.661 |
| 0.8173800327933877 | 0.662 |
| 0.8174739980003047 | 0.662 |
| 0.8174739980003047 | 0.663 |
| 0.81801863560738 | 0.663 |
| 0.81801863560738 | 0.664 |
| 0.8183731135270811 | 0.664 |
| 0.8183731135270811 | 0.665 |
| 0.8184889028828422 | 0.665 |
| 0.8184889028828422 | 0.666 |
| 0.8188853070813994 | 0.666 |
| 0.8188853070813994 | 0.667 |
| 0.8200465091183649 | 0.667 |
| 0.8200465091183649 | 0.668 |
| 0.8206241466640288 | 0.668 |
| 0.8206241466640288 | 0.669 |
| 0.8211149179678606 | 0.669 |
| 0.8211149179678606 | 0.67 |
| 0.8217598363746983 | 0.67 |
| 0.8217598363746983 | 0.671 |
| 0.8223900363704881 | 0.671 |
| 0.8223900363704881 | 0.672 |
| 0.8225900186571014 | 0.672 |
| 0.8225900186571014 | 0.673 |
| 0.8241072458204203 | 0.673 |
| 0.8241072458204203 | 0.674 |
| 0.8242858136484837 | 0.674 |
| 0.8242858136484837 | 0.675 |
| 0.8243149197878812 | 0.675 |
| 0.8243149197878812 | 0.676 |
| 0.8245675485733559 | 0.676 |
| 0.8245675485733559 | 0.677 |
| 0.8251191765501322 | 0.677 |
| 0.8251191765501322 | 0.678 |
| 0.8263336720188437 | 0.678 |
| 0.8263336720188437 | 0.679 |
| 0.8270432951745045 | 0.679 |
| 0.8270432951745045 | 0.68 |
| 0.8293808328484124 | 0.68 |
| 0.8293808328484124 | 0.681 |
| 0.8297800955911879 | 0.681 |
| 0.8297800955911879 | 0.682 |
| 0.830377814590249 | 0.682 |
| 0.830377814590249 | 0.683 |
| 0.8304245966316818 | 0.683 |
| 0.8304245966316818 | 0.684 |
| 0.8316963327251344 | 0.684 |
| 0.8316963327251344 | 0.685 |
| 0.8318630655862916 | 0.685 |
| 0.8318630655862916 | 0.686 |
| 0.8318786739683991 | 0.686 |
| 0.8318786739683991 | 0.687 |
| 0.8324097034456521 | 0.687 |
| 0.8324097034456521 | 0.688 |
| 0.8328880273734436 | 0.688 |
| 0.8328880273734436 | 0.689 |
| 0.8338238696729474 | 0.689 |
| 0.8338238696729474 | 0.69 |
| 0.8345467092771438 | 0.69 |
| 0.8345467092771438 | 0.691 |
| 0.8356865237403466 | 0.691 |
| 0.8356865237403466 | 0.692 |
| 0.8358142915470234 | 0.692 |
| 0.8358142915470234 | 0.693 |
| 0.8365581017247976 | 0.693 |
| 0.8365581017247976 | 0.694 |
| 0.8368748553965812 | 0.694 |
| 0.8368748553965812 | 0.695 |
| 0.8368971318759624 | 0.695 |
| 0.8368971318759624 | 0.696 |
| 0.8373702727764486 | 0.696 |
| 0.8373702727764486 | 0.697 |
| 0.8381487083846549 | 0.697 |
| 0.8381487083846549 | 0.698 |
| 0.8398951662170379 | 0.698 |
| 0.8398951662170379 | 0.699 |
| 0.8412481949805983 | 0.699 |
| 0.8412481949805983 | 0.7 |
| 0.8418233637712929 | 0.7 |
| 0.8418233637712929 | 0.701 |
| 0.8424181402431646 | 0.701 |
| 0.8424181402431646 | 0.702 |
| 0.8447065980297709 | 0.702 |
| 0.8447065980297709 | 0.703 |
| 0.8449344520976512 | 0.703 |
| 0.8449344520976512 | 0.704 |
| 0.8462637258761989 | 0.704 |
| 0.8462637258761989 | 0.705 |
| 0.8464534147030698 | 0.705 |
| 0.8464534147030698 | 0.706 |
| 0.8468826699629495 | 0.706 |
| 0.8468826699629495 | 0.707 |
| 0.847466940869593 | 0.707 |
| 0.847466940869593 | 0.708 |
| 0.8476714004260265 | 0.708 |
| 0.8476714004260265 | 0.709 |
| 0.847934235921023 | 0.709 |
| 0.847934235921023 | 0.71 |
| 0.8479671890299477 | 0.71 |
| 0.8479671890299477 | 0.711 |
| 0.8480589569221583 | 0.711 |
| 0.8480589569221583 | 0.712 |
| 0.8486969115973722 | 0.712 |
| 0.8486969115973722 | 0.713 |
| 0.8498276110240766 | 0.713 |
| 0.8498276110240766 | 0.714 |
| 0.8503297338808143 | 0.714 |
| 0.8503297338808143 | 0.715 |
| 0.8509422197578367 | 0.715 |
| 0.8509422197578367 | 0.716 |
| 0.8509467715962451 | 0.716 |
| 0.8509467715962451 | 0.717 |
| 0.8514861288429342 | 0.717 |
| 0.8514861288429342 | 0.718 |
| 0.8516625308197437 | 0.718 |
| 0.8516625308197437 | 0.719 |
| 0.8517171633848731 | 0.719 |
| 0.8517171633848731 | 0.72 |
| 0.8524200385180081 | 0.72 |
| 0.8524200385180081 | 0.721 |
| 0.8525172238569962 | 0.721 |
| 0.8525172238569962 | 0.722 |
| 0.8535205137716596 | 0.722 |
| 0.8535205137716596 | 0.723 |
| 0.8536897284342331 | 0.723 |
| 0.8536897284342331 | 0.724 |
| 0.8537463551156799 | 0.724 |
| 0.8537463551156799 | 0.725 |
| 0.8540659785649526 | 0.725 |
| 0.8540659785649526 | 0.726 |
| 0.854171363404975 | 0.726 |
| 0.854171363404975 | 0.727 |
| 0.8542639027203954 | 0.727 |
| 0.8542639027203954 | 0.728 |
| 0.8555763597820852 | 0.728 |
| 0.8555763597820852 | 0.729 |
| 0.8563559794500828 | 0.729 |
| 0.8563559794500828 | 0.73 |
| 0.8565780415747111 | 0.73 |
| 0.8565780415747111 | 0.731 |
| 0.8572194716819215 | 0.731 |
| 0.8572194716819215 | 0.732 |
| 0.8574506845166299 | 0.732 |
| 0.8574506845166299 | 0.733 |
| 0.8574943146336881 | 0.733 |
| 0.8574943146336881 | 0.734 |
| 0.8576670890821496 | 0.734 |
| 0.8576670890821496 | 0.735 |
| 0.8577380741356055 | 0.735 |
| 0.8577380741356055 | 0.736 |
| 0.857809789652515 | 0.736 |
| 0.857809789652515 | 0.737 |
| 0.8579432512126182 | 0.737 |
| 0.8579432512126182 | 0.738 |
| 0.8584141643262425 | 0.738 |
| 0.8584141643262425 | 0.739 |
| 0.8585389932581374 | 0.739 |
| 0.8585389932581374 | 0.74 |
| 0.8601182119843804 | 0.74 |
| 0.8601182119843804 | 0.741 |
| 0.8602345818272596 | 0.741 |
| 0.8602345818272596 | 0.742 |
| 0.8602868289891099 | 0.742 |
| 0.8602868289891099 | 0.743 |
| 0.8610956743443839 | 0.743 |
| 0.8610956743443839 | 0.744 |
| 0.8615013274137284 | 0.744 |
| 0.8615013274137284 | 0.745 |
| 0.8617789274494094 | 0.745 |
| 0.8617789274494094 | 0.746 |
| 0.8621866135025469 | 0.746 |
| 0.8621866135025469 | 0.747 |
| 0.8655491735856864 | 0.747 |
| 0.8655491735856864 | 0.748 |
| 0.8661154728194661 | 0.748 |
| 0.8661154728194661 | 0.749 |
| 0.8665964055380501 | 0.749 |
| 0.8665964055380501 | 0.75 |
| 0.8672166620295092 | 0.75 |
| 0.8672166620295092 | 0.751 |
| 0.8681037356311697 | 0.751 |
| 0.8681037356311697 | 0.752 |
| 0.8684517869629752 | 0.752 |
| 0.8684517869629752 | 0.753 |
| 0.8685534571751456 | 0.753 |
| 0.8685534571751456 | 0.754 |
| 0.8702295446381971 | 0.754 |
| 0.8702295446381971 | 0.755 |
| 0.8709995318814803 | 0.755 |
| 0.8709995318814803 | 0.756 |
| 0.8715351550146373 | 0.756 |
| 0.8715351550146373 | 0.757 |
| 0.8737314145141654 | 0.757 |
| 0.8737314145141654 | 0.758 |
| 0.8744757251583566 | 0.758 |
| 0.8744757251583566 | 0.759 |
| 0.8754034261448618 | 0.759 |
| 0.8754034261448618 | 0.76 |
| 0.8754295625026918 | 0.76 |
| 0.8754295625026918 | 0.761 |
| 0.875623259166434 | 0.761 |
| 0.875623259166434 | 0.762 |
| 0.8758396473721405 | 0.762 |
| 0.8758396473721405 | 0.763 |
| 0.8762464260300574 | 0.763 |
| 0.8762464260300574 | 0.764 |
| 0.8762695557050244 | 0.764 |
| 0.8762695557050244 | 0.765 |
| 0.8770877579962192 | 0.765 |
| 0.8770877579962192 | 0.766 |
| 0.8776995580871099 | 0.766 |
| 0.8776995580871099 | 0.767 |
| 0.8782623337114016 | 0.767 |
| 0.8782623337114016 | 0.768 |
| 0.8789527615539244 | 0.768 |
| 0.8789527615539244 | 0.769 |
| 0.879307656471566 | 0.769 |
| 0.879307656471566 | 0.77 |
| 0.8821414568157099 | 0.77 |
| 0.8821414568157099 | 0.771 |
| 0.8830438150722757 | 0.771 |
| 0.8830438150722757 | 0.772 |
| 0.8832384395424301 | 0.772 |
| 0.8832384395424301 | 0.773 |
| 0.8837904812853027 | 0.773 |
| 0.8837904812853027 | 0.774 |
| 0.8842790969423092 | 0.774 |
| 0.8842790969423092 | 0.775 |
| 0.8846826465365538 | 0.775 |
| 0.8846826465365538 | 0.776 |
| 0.8864422194561734 | 0.776 |
| 0.8864422194561734 | 0.777 |
| 0.8866052297145455 | 0.777 |
| 0.8866052297145455 | 0.778 |
| 0.8872979204890094 | 0.778 |
| 0.8872979204890094 | 0.779 |
| 0.8886017461145103 | 0.779 |
| 0.8886017461145103 | 0.78 |
| 0.8892236054804247 | 0.78 |
| 0.8892236054804247 | 0.781 |
| 0.8899659757051267 | 0.781 |
| 0.8899659757051267 | 0.782 |
| 0.8905729275027437 | 0.782 |
| 0.8905729275027437 | 0.783 |
| 0.8916106857938936 | 0.783 |
| 0.8916106857938936 | 0.784 |
| 0.8927392091692398 | 0.784 |
| 0.8927392091692398 | 0.785 |
| 0.8930511174363321 | 0.785 |
| 0.8930511174363321 | 0.786 |
| 0.8937098809256872 | 0.786 |
| 0.8937098809256872 | 0.787 |
| 0.8943125261442066 | 0.787 |
| 0.8943125261442066 | 0.788 |
| 0.8945994644509359 | 0.788 |
| 0.8945994644509359 | 0.789 |
| 0.8946573091877742 | 0.789 |
| 0.8946573091877742 | 0.79 |
| 0.8952492938771661 | 0.79 |
| 0.8952492938771661 | 0.791 |
| 0.8959298339846495 | 0.791 |
| 0.8959298339846495 | 0.792 |
| 0.8961166380914222 | 0.792 |
| 0.8961166380914222 | 0.793 |
| 0.8966364547189025 | 0.793 |
| 0.8966364547189025 | 0.794 |
| 0.896733679495655 | 0.794 |
| 0.896733679495655 | 0.795 |
| 0.898186534137497 | 0.795 |
| 0.898186534137497 | 0.796 |
| 0.8982200307634712 | 0.796 |
| 0.8982200307634712 | 0.797 |
| 0.8982400624029053 | 0.797 |
| 0.8982400624029053 | 0.798 |
| 0.898287302988112 | 0.798 |
| 0.898287302988112 | 0.799 |
| 0.8983441110420136 | 0.799 |
| 0.8983441110420136 | 0.8 |
| 0.8995444114511726 | 0.8 |
| 0.8995444114511726 | 0.801 |
| 0.9002835993211556 | 0.801 |
| 0.9002835993211556 | 0.802 |
| 0.9008889054208792 | 0.802 |
| 0.9008889054208792 | 0.803 |
| 0.9010818398027713 | 0.803 |
| 0.9010818398027713 | 0.804 |
| 0.9016463334374711 | 0.804 |
| 0.9016463334374711 | 0.805 |
| 0.9016731751919957 | 0.805 |
| 0.9016731751919957 | 0.806 |
| 0.9016767808149143 | 0.806 |
| 0.9016767808149143 | 0.807 |
| 0.9017580068357326 | 0.807 |
| 0.9017580068357326 | 0.808 |
| 0.9025793706840394 | 0.808 |
| 0.9025793706840394 | 0.809 |
| 0.9043851204081507 | 0.809 |
| 0.9043851204081507 | 0.81 |
| 0.9050560826191376 | 0.81 |
| 0.9050560826191376 | 0.811 |
| 0.9053876134985677 | 0.811 |
| 0.9053876134985677 | 0.812 |
| 0.9055255466345281 | 0.812 |
| 0.9055255466345281 | 0.813 |
| 0.9063266439160106 | 0.813 |
| 0.9063266439160106 | 0.814 |
| 0.9069406250545172 | 0.814 |
| 0.9069406250545172 | 0.815 |
| 0.906949828554836 | 0.815 |
| 0.906949828554836 | 0.816 |
| 0.9081504639164979 | 0.816 |
| 0.9081504639164979 | 0.817 |
| 0.9083978631796679 | 0.817 |
| 0.9083978631796679 | 0.818 |
| 0.9088073138089021 | 0.818 |
| 0.9088073138089021 | 0.819 |
| 0.9096458951040006 | 0.819 |
| 0.9096458951040006 | 0.82 |
| 0.9099763252110037 | 0.82 |
| 0.9099763252110037 | 0.821 |
| 0.9100302049913569 | 0.821 |
| 0.9100302049913569 | 0.822 |
| 0.9112151593725827 | 0.822 |
| 0.9112151593725827 | 0.823 |
| 0.9114609449712598 | 0.823 |
| 0.9114609449712598 | 0.824 |
| 0.9125297871441526 | 0.824 |
| 0.9125297871441526 | 0.825 |
| 0.9129371955157971 | 0.825 |
| 0.9129371955157971 | 0.826 |
| 0.9149369403627212 | 0.826 |
| 0.9149369403627212 | 0.827 |
| 0.9156347204180654 | 0.827 |
| 0.9156347204180654 | 0.828 |
| 0.9167511361908711 | 0.828 |
| 0.9167511361908711 | 0.829 |
| 0.9168645909890707 | 0.829 |
| 0.9168645909890707 | 0.83 |
| 0.9179266062903838 | 0.83 |
| 0.9179266062903838 | 0.831 |
| 0.9182228595021318 | 0.831 |
| 0.9182228595021318 | 0.832 |
| 0.918341497525214 | 0.832 |
| 0.918341497525214 | 0.833 |
| 0.9183462047341008 | 0.833 |
| 0.9183462047341008 | 0.834 |
| 0.920484492876844 | 0.834 |
| 0.920484492876844 | 0.835 |
| 0.9205859561845251 | 0.835 |
| 0.9205859561845251 | 0.836 |
| 0.921360306954295 | 0.836 |
| 0.921360306954295 | 0.837 |
| 0.9217311196818911 | 0.837 |
| 0.9217311196818911 | 0.838 |
| 0.9220762533807755 | 0.838 |
| 0.9220762533807755 | 0.839 |
| 0.9221166343128786 | 0.839 |
| 0.9221166343128786 | 0.84 |
| 0.9222637868510184 | 0.84 |
| 0.9222637868510184 | 0.841 |
| 0.9227486440553252 | 0.841 |
| 0.9227486440553252 | 0.842 |
| 0.9232308645500449 | 0.842 |
| 0.9232308645500449 | 0.843 |
| 0.923444755147953 | 0.843 |
| 0.923444755147953 | 0.844 |
| 0.9234589011089284 | 0.844 |
| 0.9234589011089284 | 0.845 |
| 0.9239416457986912 | 0.845 |
| 0.9239416457986912 | 0.846 |
| 0.924884238562547 | 0.846 |
| 0.924884238562547 | 0.847 |
| 0.9252117909185877 | 0.847 |
| 0.9252117909185877 | 0.848 |
| 0.9253484809317972 | 0.848 |
| 0.9253484809317972 | 0.849 |
| 0.9254137184277113 | 0.849 |
| 0.9254137184277113 | 0.85 |
| 0.9265986403731901 | 0.85 |
| 0.9265986403731901 | 0.851 |
| 0.9275963465979197 | 0.851 |
| 0.9275963465979197 | 0.852 |
| 0.9281295931913944 | 0.852 |
| 0.9281295931913944 | 0.853 |
| 0.9288882368658656 | 0.853 |
| 0.9288882368658656 | 0.854 |
| 0.9290918493653265 | 0.854 |
| 0.9290918493653265 | 0.855 |
| 0.9294817972295645 | 0.855 |
| 0.9294817972295645 | 0.856 |
| 0.9298329156326315 | 0.856 |
| 0.9298329156326315 | 0.857 |
| 0.9304165914145583 | 0.857 |
| 0.9304165914145583 | 0.858 |
| 0.9304389668029651 | 0.858 |
| 0.9304389668029651 | 0.859 |
| 0.9304836201211709 | 0.859 |
| 0.9304836201211709 | 0.86 |
| 0.9308597450637032 | 0.86 |
| 0.9308597450637032 | 0.861 |
| 0.9309847556801406 | 0.861 |
| 0.9309847556801406 | 0.862 |
| 0.9318876387736391 | 0.862 |
| 0.9318876387736391 | 0.863 |
| 0.9322382828908661 | 0.863 |
| 0.9322382828908661 | 0.864 |
| 0.932384883781111 | 0.864 |
| 0.932384883781111 | 0.865 |
| 0.9341101659461059 | 0.865 |
| 0.9341101659461059 | 0.866 |
| 0.9349417550124406 | 0.866 |
| 0.9349417550124406 | 0.867 |
| 0.935319125966777 | 0.867 |
| 0.935319125966777 | 0.868 |
| 0.9354744812409418 | 0.868 |
| 0.9354744812409418 | 0.869 |
| 0.9356752032913334 | 0.869 |
| 0.9356752032913334 | 0.87 |
| 0.936043671564411 | 0.87 |
| 0.936043671564411 | 0.871 |
| 0.9364978180899991 | 0.871 |
| 0.9364978180899991 | 0.872 |
| 0.9366596242966425 | 0.872 |
| 0.9366596242966425 | 0.873 |
| 0.9371016290629283 | 0.873 |
| 0.9371016290629283 | 0.874 |
| 0.938015604278051 | 0.874 |
| 0.938015604278051 | 0.875 |
| 0.9392833082524027 | 0.875 |
| 0.9392833082524027 | 0.876 |
| 0.9402772660585841 | 0.876 |
| 0.9402772660585841 | 0.877 |
| 0.9407192517339565 | 0.877 |
| 0.9407192517339565 | 0.878 |
| 0.9409241251422381 | 0.878 |
| 0.9409241251422381 | 0.879 |
| 0.9411552282165363 | 0.879 |
| 0.9411552282165363 | 0.88 |
| 0.941722503133526 | 0.88 |
| 0.941722503133526 | 0.881 |
| 0.941996977664145 | 0.881 |
| 0.941996977664145 | 0.882 |
| 0.9430230700013641 | 0.882 |
| 0.9430230700013641 | 0.883 |
| 0.9443213330152923 | 0.883 |
| 0.9443213330152923 | 0.884 |
| 0.944815155699801 | 0.884 |
| 0.944815155699801 | 0.885 |
| 0.9448155839614832 | 0.885 |
| 0.9448155839614832 | 0.886 |
| 0.9454945406406853 | 0.886 |
| 0.9454945406406853 | 0.887 |
| 0.9457128285459295 | 0.887 |
| 0.9457128285459295 | 0.888 |
| 0.946252284748408 | 0.888 |
| 0.946252284748408 | 0.889 |
| 0.9468055349848 | 0.889 |
| 0.9468055349848 | 0.89 |
| 0.9475739914961563 | 0.89 |
| 0.9475739914961563 | 0.891 |
| 0.9486087115766111 | 0.891 |
| 0.9486087115766111 | 0.892 |
| 0.9491216997048142 | 0.892 |
| 0.9491216997048142 | 0.893 |
| 0.9492951597320071 | 0.893 |
| 0.9492951597320071 | 0.894 |
| 0.9493443821250903 | 0.894 |
| 0.9493443821250903 | 0.895 |
| 0.9496341531917656 | 0.895 |
| 0.9496341531917656 | 0.896 |
| 0.9501842958160471 | 0.896 |
| 0.9501842958160471 | 0.897 |
| 0.9502440448227192 | 0.897 |
| 0.9502440448227192 | 0.898 |
| 0.950584071378641 | 0.898 |
| 0.950584071378641 | 0.899 |
| 0.9517172398649338 | 0.899 |
| 0.9517172398649338 | 0.9 |
| 0.9524999577814662 | 0.9 |
| 0.9524999577814662 | 0.901 |
| 0.9532496911084124 | 0.901 |
| 0.9532496911084124 | 0.902 |
| 0.9537783191014101 | 0.902 |
| 0.9537783191014101 | 0.903 |
| 0.9548197958900058 | 0.903 |
| 0.9548197958900058 | 0.904 |
| 0.9550801732903276 | 0.904 |
| 0.9550801732903276 | 0.905 |
| 0.9553764023552803 | 0.905 |
| 0.9553764023552803 | 0.906 |
| 0.9570286675066099 | 0.906 |
| 0.9570286675066099 | 0.907 |
| 0.9576249920695005 | 0.907 |
| 0.9576249920695005 | 0.908 |
| 0.958139395301243 | 0.908 |
| 0.958139395301243 | 0.909 |
| 0.9586815388216171 | 0.909 |
| 0.9586815388216171 | 0.91 |
| 0.9587962662380256 | 0.91 |
| 0.9587962662380256 | 0.911 |
| 0.9590061632889425 | 0.911 |
| 0.9590061632889425 | 0.912 |
| 0.9593024444312359 | 0.912 |
| 0.9593024444312359 | 0.913 |
| 0.9593160200039603 | 0.913 |
| 0.9593160200039603 | 0.914 |
| 0.9594818969107356 | 0.914 |
| 0.9594818969107356 | 0.915 |
| 0.959544967573399 | 0.915 |
| 0.959544967573399 | 0.916 |
| 0.9596200812396435 | 0.916 |
| 0.9596200812396435 | 0.917 |
| 0.9617825148072766 | 0.917 |
| 0.9617825148072766 | 0.918 |
| 0.9619799226988073 | 0.918 |
| 0.9619799226988073 | 0.919 |
| 0.9630480989838353 | 0.919 |
| 0.9630480989838353 | 0.92 |
| 0.9641319497149309 | 0.92 |
| 0.9641319497149309 | 0.921 |
| 0.9648340512766652 | 0.921 |
| 0.9648340512766652 | 0.922 |
| 0.9651731150561589 | 0.922 |
| 0.9651731150561589 | 0.923 |
| 0.965455184495241 | 0.923 |
| 0.965455184495241 | 0.924 |
| 0.965690135846264 | 0.924 |
| 0.965690135846264 | 0.925 |
| 0.9657993358099659 | 0.925 |
| 0.9657993358099659 | 0.926 |
| 0.9658760098454251 | 0.926 |
| 0.9658760098454251 | 0.927 |
| 0.9660519388034764 | 0.927 |
| 0.9660519388034764 | 0.928 |
| 0.9668974080412168 | 0.928 |
| 0.9668974080412168 | 0.929 |
| 0.9671624313799172 | 0.929 |
| 0.9671624313799172 | 0.93 |
| 0.9672092302428584 | 0.93 |
| 0.9672092302428584 | 0.931 |
| 0.967859064375943 | 0.931 |
| 0.967859064375943 | 0.932 |
| 0.9686831393537327 | 0.932 |
| 0.9686831393537327 | 0.933 |
| 0.9697561251924683 | 0.933 |
| 0.9697561251924683 | 0.934 |
| 0.969855304832069 | 0.934 |
| 0.969855304832069 | 0.935 |
| 0.9700156355525698 | 0.935 |
| 0.9700156355525698 | 0.936 |
| 0.970507138880799 | 0.936 |
| 0.970507138880799 | 0.937 |
| 0.9706608525047346 | 0.937 |
| 0.9706608525047346 | 0.938 |
| 0.9706986825165699 | 0.938 |
| 0.9706986825165699 | 0.939 |
| 0.9720835524729149 | 0.939 |
| 0.9720835524729149 | 0.94 |
| 0.9726611176659792 | 0.94 |
| 0.9726611176659792 | 0.941 |
| 0.9729854052984587 | 0.941 |
| 0.9729854052984587 | 0.942 |
| 0.9739993015396289 | 0.942 |
| 0.9739993015396289 | 0.943 |
| 0.9740194166422599 | 0.943 |
| 0.9740194166422599 | 0.944 |
| 0.9745332586225272 | 0.944 |
| 0.9745332586225272 | 0.945 |
| 0.9749156444975434 | 0.945 |
| 0.9749156444975434 | 0.946 |
| 0.9753690149107984 | 0.946 |
| 0.9753690149107984 | 0.947 |
| 0.9758410901996665 | 0.947 |
| 0.9758410901996665 | 0.948 |
| 0.9761548636599043 | 0.948 |
| 0.9761548636599043 | 0.949 |
| 0.9761602680665266 | 0.949 |
| 0.9761602680665266 | 0.95 |
| 0.9764328755379694 | 0.95 |
| 0.9764328755379694 | 0.951 |
| 0.978230803632979 | 0.951 |
| 0.978230803632979 | 0.952 |
| 0.978510297227041 | 0.952 |
| 0.978510297227041 | 0.953 |
| 0.9789705386458849 | 0.953 |
| 0.9789705386458849 | 0.954 |
| 0.9790752105410397 | 0.954 |
| 0.9790752105410397 | 0.955 |
| 0.9795777699485165 | 0.955 |
| 0.9795777699485165 | 0.956 |
| 0.979927590442442 | 0.956 |
| 0.979927590442442 | 0.957 |
| 0.9801881445506245 | 0.957 |
| 0.9801881445506245 | 0.958 |
| 0.9807794973741802 | 0.958 |
| 0.9807794973741802 | 0.959 |
| 0.9812980990648462 | 0.959 |
| 0.9812980990648462 | 0.96 |
| 0.981302746713455 | 0.96 |
| 0.981302746713455 | 0.961 |
| 0.981766132092587 | 0.961 |
| 0.981766132092587 | 0.962 |
| 0.9827762056007832 | 0.962 |
| 0.9827762056007832 | 0.963 |
| 0.9829846923334751 | 0.963 |
| 0.9829846923334751 | 0.964 |
| 0.9835013122745767 | 0.964 |
| 0.9835013122745767 | 0.965 |
| 0.9837381862193342 | 0.965 |
| 0.9837381862193342 | 0.966 |
| 0.9837801749276872 | 0.966 |
| 0.9837801749276872 | 0.967 |
| 0.9844527569464878 | 0.967 |
| 0.9844527569464878 | 0.968 |
| 0.9846316922499566 | 0.968 |
| 0.9846316922499566 | 0.969 |
| 0.9850716452886346 | 0.969 |
| 0.9850716452886346 | 0.97 |
| 0.9853232079405271 | 0.97 |
| 0.9853232079405271 | 0.971 |
| 0.9854216680730604 | 0.971 |
| 0.9854216680730604 | 0.972 |
| 0.9856031352278322 | 0.972 |
| 0.9856031352278322 | 0.973 |
| 0.9857243673081656 | 0.973 |
| 0.9857243673081656 | 0.974 |
| 0.9858643377691448 | 0.974 |
| 0.9858643377691448 | 0.975 |
| 0.98614097465571 | 0.975 |
| 0.98614097465571 | 0.976 |
| 0.9861478578450358 | 0.976 |
| 0.9861478578450358 | 0.977 |
| 0.9863402712369784 | 0.977 |
| 0.9863402712369784 | 0.978 |
| 0.9867236024349031 | 0.978 |
| 0.9867236024349031 | 0.979 |
| 0.9886398178562716 | 0.979 |
| 0.9886398178562716 | 0.98 |
| 0.9896023777547133 | 0.98 |
| 0.9896023777547133 | 0.981 |
| 0.9899379280929662 | 0.981 |
| 0.9899379280929662 | 0.982 |
| 0.9900300370248597 | 0.982 |
| 0.9900300370248597 | 0.983 |
| 0.9910738769948717 | 0.983 |
| 0.9910738769948717 | 0.984 |
| 0.9929191347982125 | 0.984 |
| 0.9929191347982125 | 0.985 |
| 0.9929264796637345 | 0.985 |
| 0.9929264796637345 | 0.986 |
| 0.9932980263967622 | 0.986 |
| 0.9932980263967622 | 0.987 |
| 0.9936329542089296 | 0.987 |
| 0.9936329542089296 | 0.988 |
| 0.993771120529947 | 0.988 |
| 0.993771120529947 | 0.989 |
| 0.9938073181773431 | 0.989 |
| 0.9938073181773431 | 0.99 |
| 0.9941012951472571 | 0.99 |
| 0.9941012951472571 | 0.991 |
| 0.9955931044612027 | 0.991 |
| 0.9955931044612027 | 0.992 |
| 0.9959392304788122 | 0.992 |
| 0.9959392304788122 | 0.993 |
| 0.9961562644597818 | 0.993 |
| 0.9961562644597818 | 0.994 |
| 0.9969305285546641 | 0.994 |
| 0.9969305285546641 | 0.995 |
| 0.9991665389097483 | 0.995 |
| 0.9991665389097483 | 0.996 |
| 0.9993288614704078 | 0.996 |
| 0.9993288614704078 | 0.997 |
| 0.9996180887872703 | 0.997 |
| 0.9996180887872703 | 0.998 |
| 0.9999900497806026 | 0.998 |
| 0.9999900497806026 | 0.999 |
| 0.9999914764933764 | 0.999 |
| 0.9999914764933764 | 1 |